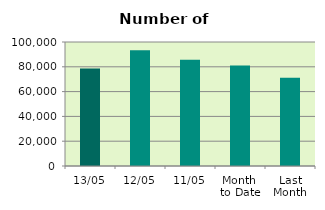
| Category | Series 0 |
|---|---|
| 13/05 | 78696 |
| 12/05 | 93330 |
| 11/05 | 85612 |
| Month 
to Date | 81038.25 |
| Last
Month | 71251.4 |